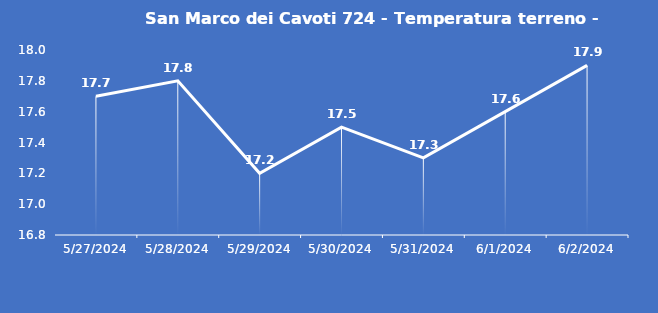
| Category | San Marco dei Cavoti 724 - Temperatura terreno - Grezzo (°C) |
|---|---|
| 5/27/24 | 17.7 |
| 5/28/24 | 17.8 |
| 5/29/24 | 17.2 |
| 5/30/24 | 17.5 |
| 5/31/24 | 17.3 |
| 6/1/24 | 17.6 |
| 6/2/24 | 17.9 |